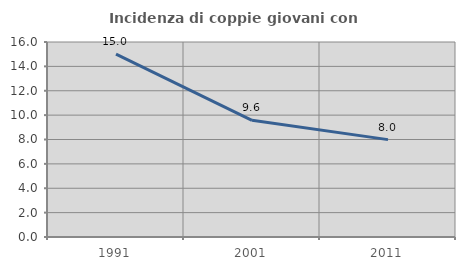
| Category | Incidenza di coppie giovani con figli |
|---|---|
| 1991.0 | 15.01 |
| 2001.0 | 9.572 |
| 2011.0 | 7.989 |